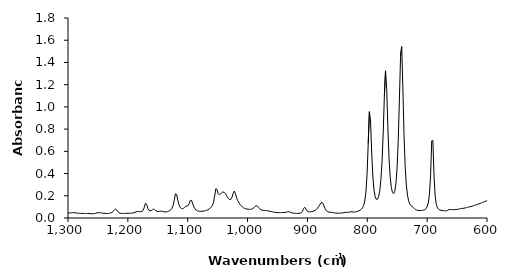
| Category | Series 0 |
|---|---|
| 599.7828 | 0.157 |
| 601.7113 | 0.152 |
| 603.6399 | 0.148 |
| 605.5684 | 0.144 |
| 607.497 | 0.14 |
| 609.4256 | 0.135 |
| 611.3541 | 0.132 |
| 613.2827 | 0.128 |
| 615.2112 | 0.124 |
| 617.1398 | 0.12 |
| 619.0684 | 0.117 |
| 620.9969 | 0.113 |
| 622.9255 | 0.11 |
| 624.8541 | 0.107 |
| 626.7827 | 0.104 |
| 628.7112 | 0.101 |
| 630.6398 | 0.098 |
| 632.5683 | 0.096 |
| 634.4969 | 0.093 |
| 636.4254 | 0.091 |
| 638.354 | 0.088 |
| 640.2826 | 0.087 |
| 642.2111 | 0.086 |
| 644.1397 | 0.084 |
| 646.0682 | 0.082 |
| 647.9968 | 0.079 |
| 649.9254 | 0.077 |
| 651.8539 | 0.076 |
| 653.7825 | 0.076 |
| 655.7111 | 0.075 |
| 657.6396 | 0.075 |
| 659.5682 | 0.076 |
| 661.4968 | 0.077 |
| 663.4253 | 0.076 |
| 665.3539 | 0.071 |
| 667.2824 | 0.064 |
| 669.211 | 0.063 |
| 671.1396 | 0.066 |
| 673.0681 | 0.066 |
| 674.9967 | 0.067 |
| 676.9252 | 0.069 |
| 678.8538 | 0.072 |
| 680.7823 | 0.078 |
| 682.7109 | 0.091 |
| 684.6395 | 0.121 |
| 686.5681 | 0.197 |
| 688.4966 | 0.379 |
| 690.4252 | 0.697 |
| 692.3538 | 0.695 |
| 694.2823 | 0.38 |
| 696.2109 | 0.209 |
| 698.1394 | 0.135 |
| 700.068 | 0.101 |
| 701.9966 | 0.083 |
| 703.9251 | 0.075 |
| 705.8537 | 0.071 |
| 707.7822 | 0.069 |
| 709.7108 | 0.068 |
| 711.6393 | 0.067 |
| 713.5679 | 0.067 |
| 715.4965 | 0.069 |
| 717.425 | 0.072 |
| 719.3536 | 0.077 |
| 721.2822 | 0.084 |
| 723.2108 | 0.095 |
| 725.1393 | 0.104 |
| 727.0679 | 0.112 |
| 728.9964 | 0.126 |
| 730.925 | 0.155 |
| 732.8535 | 0.206 |
| 734.7821 | 0.298 |
| 736.7107 | 0.465 |
| 738.6392 | 0.751 |
| 740.5678 | 1.169 |
| 742.4963 | 1.543 |
| 744.4249 | 1.454 |
| 746.3535 | 1.064 |
| 748.282 | 0.699 |
| 750.2106 | 0.451 |
| 752.1392 | 0.31 |
| 754.0677 | 0.241 |
| 755.9963 | 0.218 |
| 757.9249 | 0.229 |
| 759.8534 | 0.276 |
| 761.782 | 0.371 |
| 763.7105 | 0.543 |
| 765.6391 | 0.821 |
| 767.5677 | 1.167 |
| 769.4962 | 1.325 |
| 771.4248 | 1.102 |
| 773.3533 | 0.776 |
| 775.2819 | 0.515 |
| 777.2104 | 0.345 |
| 779.139 | 0.245 |
| 781.0676 | 0.192 |
| 782.9962 | 0.169 |
| 784.9247 | 0.168 |
| 786.8533 | 0.191 |
| 788.7819 | 0.251 |
| 790.7104 | 0.373 |
| 792.639 | 0.587 |
| 794.5675 | 0.874 |
| 796.4961 | 0.957 |
| 798.4247 | 0.671 |
| 800.3532 | 0.393 |
| 802.2818 | 0.233 |
| 804.2103 | 0.153 |
| 806.1389 | 0.113 |
| 808.0674 | 0.091 |
| 809.996 | 0.078 |
| 811.9246 | 0.07 |
| 813.8531 | 0.065 |
| 815.7817 | 0.061 |
| 817.7103 | 0.058 |
| 819.6389 | 0.055 |
| 821.5674 | 0.053 |
| 823.496 | 0.053 |
| 825.4245 | 0.056 |
| 827.3531 | 0.057 |
| 829.2817 | 0.053 |
| 831.2102 | 0.051 |
| 833.1388 | 0.05 |
| 835.0673 | 0.051 |
| 836.9959 | 0.05 |
| 838.9244 | 0.049 |
| 840.853 | 0.047 |
| 842.7816 | 0.045 |
| 844.7101 | 0.044 |
| 846.6387 | 0.043 |
| 848.5673 | 0.043 |
| 850.4958 | 0.044 |
| 852.4244 | 0.045 |
| 854.353 | 0.046 |
| 856.2815 | 0.047 |
| 858.2101 | 0.049 |
| 860.1386 | 0.05 |
| 862.0672 | 0.051 |
| 863.9958 | 0.053 |
| 865.9243 | 0.056 |
| 867.8529 | 0.063 |
| 869.7814 | 0.077 |
| 871.71 | 0.099 |
| 873.6385 | 0.126 |
| 875.5671 | 0.141 |
| 877.4957 | 0.135 |
| 879.4243 | 0.119 |
| 881.3528 | 0.102 |
| 883.2814 | 0.088 |
| 885.21 | 0.077 |
| 887.1385 | 0.069 |
| 889.0671 | 0.063 |
| 890.9956 | 0.06 |
| 892.9242 | 0.057 |
| 894.8528 | 0.055 |
| 896.7813 | 0.055 |
| 898.7099 | 0.058 |
| 900.6384 | 0.065 |
| 902.567 | 0.08 |
| 904.4955 | 0.097 |
| 906.4241 | 0.086 |
| 908.3527 | 0.061 |
| 910.2813 | 0.048 |
| 912.2098 | 0.043 |
| 914.1384 | 0.042 |
| 916.067 | 0.041 |
| 917.9955 | 0.041 |
| 919.9241 | 0.042 |
| 921.8526 | 0.042 |
| 923.7812 | 0.044 |
| 925.7098 | 0.046 |
| 927.6383 | 0.05 |
| 929.5669 | 0.054 |
| 931.4954 | 0.057 |
| 933.424 | 0.056 |
| 935.3525 | 0.053 |
| 937.2811 | 0.05 |
| 939.2097 | 0.049 |
| 941.1382 | 0.049 |
| 943.0668 | 0.049 |
| 944.9954 | 0.048 |
| 946.924 | 0.048 |
| 948.8525 | 0.048 |
| 950.7811 | 0.049 |
| 952.7096 | 0.05 |
| 954.6382 | 0.051 |
| 956.5667 | 0.053 |
| 958.4953 | 0.055 |
| 960.4239 | 0.058 |
| 962.3524 | 0.06 |
| 964.281 | 0.063 |
| 966.2095 | 0.065 |
| 968.1381 | 0.067 |
| 970.0667 | 0.067 |
| 971.9952 | 0.068 |
| 973.9238 | 0.069 |
| 975.8524 | 0.071 |
| 977.7809 | 0.075 |
| 979.7095 | 0.083 |
| 981.6381 | 0.094 |
| 983.5666 | 0.107 |
| 985.4952 | 0.112 |
| 987.4237 | 0.104 |
| 989.3523 | 0.093 |
| 991.2809 | 0.085 |
| 993.2094 | 0.08 |
| 995.138 | 0.078 |
| 997.0665 | 0.078 |
| 998.9951 | 0.079 |
| 1000.924 | 0.081 |
| 1002.852 | 0.082 |
| 1004.781 | 0.086 |
| 1006.709 | 0.092 |
| 1008.638 | 0.1 |
| 1010.566 | 0.11 |
| 1012.495 | 0.122 |
| 1014.424 | 0.137 |
| 1016.352 | 0.156 |
| 1018.281 | 0.181 |
| 1020.209 | 0.218 |
| 1022.138 | 0.243 |
| 1024.066 | 0.223 |
| 1025.995 | 0.187 |
| 1027.924 | 0.168 |
| 1029.852 | 0.166 |
| 1031.781 | 0.173 |
| 1033.709 | 0.188 |
| 1035.638 | 0.206 |
| 1037.566 | 0.222 |
| 1039.495 | 0.233 |
| 1041.423 | 0.234 |
| 1043.352 | 0.227 |
| 1045.281 | 0.216 |
| 1047.209 | 0.209 |
| 1049.138 | 0.22 |
| 1051.066 | 0.257 |
| 1052.995 | 0.264 |
| 1054.923 | 0.2 |
| 1056.852 | 0.142 |
| 1058.781 | 0.113 |
| 1060.709 | 0.098 |
| 1062.638 | 0.087 |
| 1064.566 | 0.08 |
| 1066.495 | 0.073 |
| 1068.423 | 0.069 |
| 1070.352 | 0.066 |
| 1072.281 | 0.063 |
| 1074.209 | 0.061 |
| 1076.138 | 0.06 |
| 1078.066 | 0.06 |
| 1079.995 | 0.06 |
| 1081.923 | 0.062 |
| 1083.852 | 0.065 |
| 1085.78 | 0.071 |
| 1087.709 | 0.081 |
| 1089.638 | 0.099 |
| 1091.566 | 0.126 |
| 1093.495 | 0.157 |
| 1095.423 | 0.16 |
| 1097.352 | 0.133 |
| 1099.28 | 0.113 |
| 1101.209 | 0.108 |
| 1103.137 | 0.105 |
| 1105.066 | 0.097 |
| 1106.995 | 0.087 |
| 1108.923 | 0.083 |
| 1110.852 | 0.086 |
| 1112.78 | 0.097 |
| 1114.709 | 0.121 |
| 1116.637 | 0.162 |
| 1118.566 | 0.212 |
| 1120.495 | 0.217 |
| 1122.423 | 0.164 |
| 1124.352 | 0.114 |
| 1126.28 | 0.087 |
| 1128.209 | 0.074 |
| 1130.137 | 0.066 |
| 1132.066 | 0.06 |
| 1133.995 | 0.057 |
| 1135.923 | 0.055 |
| 1137.852 | 0.055 |
| 1139.78 | 0.056 |
| 1141.709 | 0.058 |
| 1143.637 | 0.061 |
| 1145.566 | 0.061 |
| 1147.494 | 0.059 |
| 1149.423 | 0.058 |
| 1151.352 | 0.06 |
| 1153.28 | 0.065 |
| 1155.209 | 0.074 |
| 1157.137 | 0.081 |
| 1159.066 | 0.074 |
| 1160.994 | 0.067 |
| 1162.923 | 0.065 |
| 1164.851 | 0.07 |
| 1166.78 | 0.088 |
| 1168.709 | 0.124 |
| 1170.637 | 0.133 |
| 1172.566 | 0.096 |
| 1174.494 | 0.069 |
| 1176.423 | 0.059 |
| 1178.351 | 0.057 |
| 1180.28 | 0.057 |
| 1182.208 | 0.058 |
| 1184.137 | 0.059 |
| 1186.066 | 0.056 |
| 1187.994 | 0.051 |
| 1189.923 | 0.047 |
| 1191.851 | 0.045 |
| 1193.78 | 0.044 |
| 1195.708 | 0.043 |
| 1197.637 | 0.043 |
| 1199.566 | 0.043 |
| 1201.494 | 0.042 |
| 1203.423 | 0.042 |
| 1205.351 | 0.042 |
| 1207.28 | 0.041 |
| 1209.208 | 0.041 |
| 1211.137 | 0.042 |
| 1213.066 | 0.043 |
| 1214.994 | 0.048 |
| 1216.923 | 0.059 |
| 1218.851 | 0.075 |
| 1220.78 | 0.081 |
| 1222.708 | 0.072 |
| 1224.637 | 0.06 |
| 1226.565 | 0.051 |
| 1228.494 | 0.045 |
| 1230.423 | 0.043 |
| 1232.351 | 0.041 |
| 1234.28 | 0.04 |
| 1236.208 | 0.04 |
| 1238.137 | 0.041 |
| 1240.065 | 0.043 |
| 1241.994 | 0.044 |
| 1243.922 | 0.045 |
| 1245.851 | 0.046 |
| 1247.78 | 0.048 |
| 1249.708 | 0.049 |
| 1251.637 | 0.046 |
| 1253.565 | 0.042 |
| 1255.494 | 0.039 |
| 1257.422 | 0.038 |
| 1259.351 | 0.038 |
| 1261.28 | 0.039 |
| 1263.208 | 0.04 |
| 1265.137 | 0.041 |
| 1267.065 | 0.041 |
| 1268.994 | 0.04 |
| 1270.922 | 0.04 |
| 1272.851 | 0.04 |
| 1274.779 | 0.041 |
| 1276.708 | 0.041 |
| 1278.637 | 0.042 |
| 1280.565 | 0.042 |
| 1282.494 | 0.042 |
| 1284.422 | 0.043 |
| 1286.351 | 0.045 |
| 1288.279 | 0.047 |
| 1290.208 | 0.049 |
| 1292.137 | 0.048 |
| 1294.065 | 0.047 |
| 1295.994 | 0.045 |
| 1297.922 | 0.045 |
| 1299.851 | 0.045 |
| 1301.779 | 0.046 |
| 1303.708 | 0.046 |
| 1305.636 | 0.047 |
| 1307.565 | 0.048 |
| 1309.494 | 0.048 |
| 1311.422 | 0.048 |
| 1313.351 | 0.049 |
| 1315.279 | 0.05 |
| 1317.208 | 0.051 |
| 1319.136 | 0.052 |
| 1321.065 | 0.054 |
| 1322.994 | 0.055 |
| 1324.922 | 0.055 |
| 1326.851 | 0.055 |
| 1328.779 | 0.056 |
| 1330.708 | 0.057 |
| 1332.636 | 0.058 |
| 1334.565 | 0.059 |
| 1336.493 | 0.06 |
| 1338.422 | 0.061 |
| 1340.351 | 0.063 |
| 1342.279 | 0.064 |
| 1344.208 | 0.066 |
| 1346.136 | 0.068 |
| 1348.065 | 0.07 |
| 1349.993 | 0.072 |
| 1351.922 | 0.075 |
| 1353.85 | 0.078 |
| 1355.779 | 0.081 |
| 1357.708 | 0.084 |
| 1359.636 | 0.089 |
| 1361.565 | 0.094 |
| 1363.493 | 0.102 |
| 1365.422 | 0.111 |
| 1367.35 | 0.121 |
| 1369.279 | 0.138 |
| 1371.208 | 0.17 |
| 1373.136 | 0.216 |
| 1375.065 | 0.262 |
| 1376.993 | 0.283 |
| 1378.922 | 0.277 |
| 1380.85 | 0.267 |
| 1382.779 | 0.264 |
| 1384.708 | 0.249 |
| 1386.636 | 0.21 |
| 1388.565 | 0.175 |
| 1390.493 | 0.156 |
| 1392.422 | 0.147 |
| 1394.35 | 0.143 |
| 1396.279 | 0.141 |
| 1398.207 | 0.141 |
| 1400.136 | 0.143 |
| 1402.065 | 0.145 |
| 1403.993 | 0.149 |
| 1405.922 | 0.154 |
| 1407.85 | 0.158 |
| 1409.779 | 0.162 |
| 1411.707 | 0.165 |
| 1413.636 | 0.17 |
| 1415.564 | 0.178 |
| 1417.493 | 0.187 |
| 1419.422 | 0.197 |
| 1421.35 | 0.206 |
| 1423.279 | 0.213 |
| 1425.207 | 0.22 |
| 1427.136 | 0.23 |
| 1429.064 | 0.244 |
| 1430.993 | 0.262 |
| 1432.922 | 0.283 |
| 1434.85 | 0.307 |
| 1436.779 | 0.338 |
| 1438.707 | 0.375 |
| 1440.636 | 0.412 |
| 1442.564 | 0.44 |
| 1444.493 | 0.458 |
| 1446.422 | 0.471 |
| 1448.35 | 0.49 |
| 1450.279 | 0.517 |
| 1452.207 | 0.556 |
| 1454.136 | 0.592 |
| 1456.064 | 0.603 |
| 1457.993 | 0.59 |
| 1459.921 | 0.58 |
| 1461.85 | 0.591 |
| 1463.779 | 0.629 |
| 1465.707 | 0.67 |
| 1467.636 | 0.649 |
| 1469.564 | 0.565 |
| 1471.493 | 0.49 |
| 1473.421 | 0.45 |
| 1475.35 | 0.439 |
| 1477.278 | 0.442 |
| 1479.207 | 0.448 |
| 1481.136 | 0.448 |
| 1483.064 | 0.44 |
| 1484.993 | 0.438 |
| 1486.921 | 0.461 |
| 1488.85 | 0.516 |
| 1490.778 | 0.602 |
| 1492.707 | 0.696 |
| 1494.635 | 0.742 |
| 1496.564 | 0.705 |
| 1498.493 | 0.612 |
| 1500.421 | 0.491 |
| 1502.35 | 0.388 |
| 1504.278 | 0.328 |
| 1506.207 | 0.304 |
| 1508.135 | 0.311 |
| 1510.064 | 0.343 |
| 1511.993 | 0.407 |
| 1513.921 | 0.539 |
| 1515.85 | 0.688 |
| 1517.778 | 0.606 |
| 1519.707 | 0.405 |
| 1521.635 | 0.279 |
| 1523.564 | 0.219 |
| 1525.493 | 0.189 |
| 1527.421 | 0.172 |
| 1529.35 | 0.162 |
| 1531.278 | 0.155 |
| 1533.207 | 0.152 |
| 1535.135 | 0.15 |
| 1537.064 | 0.147 |
| 1538.992 | 0.139 |
| 1540.921 | 0.133 |
| 1542.85 | 0.128 |
| 1544.778 | 0.124 |
| 1546.707 | 0.12 |
| 1548.635 | 0.116 |
| 1550.564 | 0.112 |
| 1552.492 | 0.109 |
| 1554.421 | 0.106 |
| 1556.349 | 0.103 |
| 1558.278 | 0.1 |
| 1560.207 | 0.098 |
| 1562.135 | 0.099 |
| 1564.064 | 0.098 |
| 1565.992 | 0.098 |
| 1567.921 | 0.097 |
| 1569.849 | 0.096 |
| 1571.778 | 0.096 |
| 1573.707 | 0.097 |
| 1575.635 | 0.099 |
| 1577.564 | 0.104 |
| 1579.492 | 0.112 |
| 1581.421 | 0.12 |
| 1583.349 | 0.126 |
| 1585.278 | 0.131 |
| 1587.207 | 0.144 |
| 1589.135 | 0.171 |
| 1591.064 | 0.199 |
| 1592.992 | 0.198 |
| 1594.921 | 0.175 |
| 1596.849 | 0.168 |
| 1598.778 | 0.184 |
| 1600.706 | 0.218 |
| 1602.635 | 0.266 |
| 1604.564 | 0.318 |
| 1606.492 | 0.353 |
| 1608.421 | 0.356 |
| 1610.349 | 0.356 |
| 1612.278 | 0.38 |
| 1614.206 | 0.384 |
| 1616.135 | 0.3 |
| 1618.063 | 0.195 |
| 1619.992 | 0.132 |
| 1621.921 | 0.102 |
| 1623.849 | 0.089 |
| 1625.778 | 0.085 |
| 1627.706 | 0.085 |
| 1629.635 | 0.084 |
| 1631.563 | 0.08 |
| 1633.492 | 0.073 |
| 1635.421 | 0.065 |
| 1637.349 | 0.059 |
| 1639.278 | 0.055 |
| 1641.206 | 0.052 |
| 1643.135 | 0.049 |
| 1645.063 | 0.048 |
| 1646.992 | 0.047 |
| 1648.921 | 0.048 |
| 1650.849 | 0.048 |
| 1652.778 | 0.048 |
| 1654.706 | 0.05 |
| 1656.635 | 0.052 |
| 1658.563 | 0.052 |
| 1660.492 | 0.051 |
| 1662.42 | 0.05 |
| 1664.349 | 0.05 |
| 1666.278 | 0.049 |
| 1668.206 | 0.048 |
| 1670.135 | 0.047 |
| 1672.063 | 0.046 |
| 1673.992 | 0.044 |
| 1675.92 | 0.042 |
| 1677.849 | 0.04 |
| 1679.777 | 0.038 |
| 1681.706 | 0.035 |
| 1683.635 | 0.031 |
| 1685.563 | 0.03 |
| 1687.492 | 0.031 |
| 1689.42 | 0.031 |
| 1691.349 | 0.032 |
| 1693.277 | 0.031 |
| 1695.206 | 0.029 |
| 1697.135 | 0.028 |
| 1699.063 | 0.027 |
| 1700.992 | 0.027 |
| 1702.92 | 0.029 |
| 1704.849 | 0.03 |
| 1706.777 | 0.032 |
| 1708.706 | 0.032 |
| 1710.635 | 0.031 |
| 1712.563 | 0.031 |
| 1714.492 | 0.032 |
| 1716.42 | 0.032 |
| 1718.349 | 0.032 |
| 1720.277 | 0.033 |
| 1722.206 | 0.033 |
| 1724.134 | 0.033 |
| 1726.063 | 0.033 |
| 1727.992 | 0.034 |
| 1729.92 | 0.034 |
| 1731.849 | 0.033 |
| 1733.777 | 0.033 |
| 1735.706 | 0.035 |
| 1737.634 | 0.037 |
| 1739.563 | 0.039 |
| 1741.491 | 0.04 |
| 1743.42 | 0.042 |
| 1745.349 | 0.043 |
| 1747.277 | 0.043 |
| 1749.206 | 0.042 |
| 1751.134 | 0.041 |
| 1753.063 | 0.041 |
| 1754.991 | 0.04 |
| 1756.92 | 0.04 |
| 1758.849 | 0.04 |
| 1760.777 | 0.041 |
| 1762.706 | 0.043 |
| 1764.634 | 0.045 |
| 1766.563 | 0.045 |
| 1768.491 | 0.046 |
| 1770.42 | 0.046 |
| 1772.349 | 0.046 |
| 1774.277 | 0.048 |
| 1776.206 | 0.049 |
| 1778.134 | 0.051 |
| 1780.063 | 0.053 |
| 1781.991 | 0.055 |
| 1783.92 | 0.057 |
| 1785.848 | 0.06 |
| 1787.777 | 0.062 |
| 1789.706 | 0.061 |
| 1791.634 | 0.059 |
| 1793.563 | 0.055 |
| 1795.491 | 0.051 |
| 1797.42 | 0.046 |
| 1799.348 | 0.041 |
| 1801.277 | 0.037 |
| 1803.205 | 0.034 |
| 1805.134 | 0.032 |
| 1807.063 | 0.031 |
| 1808.991 | 0.03 |
| 1810.92 | 0.029 |
| 1812.848 | 0.029 |
| 1814.777 | 0.029 |
| 1816.705 | 0.029 |
| 1818.634 | 0.03 |
| 1820.563 | 0.031 |
| 1822.491 | 0.033 |
| 1824.42 | 0.034 |
| 1826.348 | 0.036 |
| 1828.277 | 0.038 |
| 1830.205 | 0.038 |
| 1832.134 | 0.039 |
| 1834.063 | 0.039 |
| 1835.991 | 0.039 |
| 1837.92 | 0.039 |
| 1839.848 | 0.04 |
| 1841.777 | 0.041 |
| 1843.705 | 0.043 |
| 1845.634 | 0.045 |
| 1847.562 | 0.047 |
| 1849.491 | 0.05 |
| 1851.42 | 0.052 |
| 1853.348 | 0.054 |
| 1855.277 | 0.056 |
| 1857.205 | 0.056 |
| 1859.134 | 0.055 |
| 1861.062 | 0.053 |
| 1862.991 | 0.05 |
| 1864.919 | 0.046 |
| 1866.848 | 0.043 |
| 1868.777 | 0.04 |
| 1870.705 | 0.039 |
| 1872.634 | 0.039 |
| 1874.562 | 0.041 |
| 1876.491 | 0.043 |
| 1878.419 | 0.047 |
| 1880.348 | 0.051 |
| 1882.276 | 0.055 |
| 1884.205 | 0.058 |
| 1886.134 | 0.063 |
| 1888.062 | 0.067 |
| 1889.991 | 0.071 |
| 1891.919 | 0.073 |
| 1893.848 | 0.073 |
| 1895.776 | 0.07 |
| 1897.705 | 0.067 |
| 1899.634 | 0.064 |
| 1901.562 | 0.061 |
| 1903.491 | 0.057 |
| 1905.419 | 0.053 |
| 1907.348 | 0.048 |
| 1909.276 | 0.044 |
| 1911.205 | 0.041 |
| 1913.134 | 0.039 |
| 1915.062 | 0.038 |
| 1916.991 | 0.037 |
| 1918.919 | 0.038 |
| 1920.848 | 0.039 |
| 1922.776 | 0.042 |
| 1924.705 | 0.044 |
| 1926.633 | 0.047 |
| 1928.562 | 0.05 |
| 1930.491 | 0.052 |
| 1932.419 | 0.053 |
| 1934.348 | 0.054 |
| 1936.276 | 0.054 |
| 1938.205 | 0.053 |
| 1940.133 | 0.051 |
| 1942.062 | 0.049 |
| 1943.99 | 0.046 |
| 1945.919 | 0.042 |
| 1947.848 | 0.039 |
| 1949.776 | 0.036 |
| 1951.705 | 0.033 |
| 1953.633 | 0.031 |
| 1955.562 | 0.029 |
| 1957.49 | 0.028 |
| 1959.419 | 0.026 |
| 1961.348 | 0.024 |
| 1963.276 | 0.024 |
| 1965.205 | 0.023 |
| 1967.133 | 0.023 |
| 1969.062 | 0.023 |
| 1970.99 | 0.022 |
| 1972.919 | 0.022 |
| 1974.848 | 0.022 |
| 1976.776 | 0.021 |
| 1978.705 | 0.021 |
| 1980.633 | 0.021 |
| 1982.562 | 0.021 |
| 1984.49 | 0.02 |
| 1986.419 | 0.02 |
| 1988.347 | 0.02 |
| 1990.276 | 0.02 |
| 1992.205 | 0.021 |
| 1994.133 | 0.021 |
| 1996.062 | 0.021 |
| 1997.99 | 0.021 |
| 1999.919 | 0.02 |
| 2001.847 | 0.02 |
| 2003.776 | 0.019 |
| 2005.704 | 0.019 |
| 2007.633 | 0.019 |
| 2009.562 | 0.018 |
| 2011.49 | 0.018 |
| 2013.419 | 0.018 |
| 2015.347 | 0.018 |
| 2017.276 | 0.018 |
| 2019.204 | 0.018 |
| 2021.133 | 0.018 |
| 2023.062 | 0.018 |
| 2024.99 | 0.018 |
| 2026.919 | 0.018 |
| 2028.847 | 0.017 |
| 2030.776 | 0.017 |
| 2032.704 | 0.017 |
| 2034.633 | 0.017 |
| 2036.562 | 0.017 |
| 2038.49 | 0.017 |
| 2040.419 | 0.017 |
| 2042.347 | 0.017 |
| 2044.276 | 0.017 |
| 2046.204 | 0.017 |
| 2048.133 | 0.017 |
| 2050.062 | 0.017 |
| 2051.99 | 0.016 |
| 2053.918 | 0.016 |
| 2055.847 | 0.016 |
| 2057.776 | 0.016 |
| 2059.704 | 0.016 |
| 2061.633 | 0.016 |
| 2063.561 | 0.016 |
| 2065.49 | 0.016 |
| 2067.418 | 0.016 |
| 2069.347 | 0.017 |
| 2071.276 | 0.017 |
| 2073.204 | 0.018 |
| 2075.133 | 0.019 |
| 2077.061 | 0.018 |
| 2078.99 | 0.018 |
| 2080.918 | 0.017 |
| 2082.847 | 0.017 |
| 2084.776 | 0.017 |
| 2086.704 | 0.017 |
| 2088.633 | 0.017 |
| 2090.561 | 0.017 |
| 2092.49 | 0.018 |
| 2094.418 | 0.019 |
| 2096.347 | 0.02 |
| 2098.275 | 0.022 |
| 2100.204 | 0.022 |
| 2102.133 | 0.022 |
| 2104.061 | 0.021 |
| 2105.99 | 0.02 |
| 2107.918 | 0.019 |
| 2109.847 | 0.018 |
| 2111.775 | 0.018 |
| 2113.704 | 0.018 |
| 2115.633 | 0.018 |
| 2117.561 | 0.018 |
| 2119.49 | 0.017 |
| 2121.418 | 0.017 |
| 2123.347 | 0.016 |
| 2125.275 | 0.016 |
| 2127.204 | 0.016 |
| 2129.133 | 0.016 |
| 2131.061 | 0.016 |
| 2132.99 | 0.016 |
| 2134.918 | 0.016 |
| 2136.847 | 0.016 |
| 2138.775 | 0.016 |
| 2140.704 | 0.016 |
| 2142.632 | 0.016 |
| 2144.561 | 0.017 |
| 2146.49 | 0.017 |
| 2148.418 | 0.017 |
| 2150.347 | 0.017 |
| 2152.275 | 0.017 |
| 2154.204 | 0.017 |
| 2156.132 | 0.017 |
| 2158.061 | 0.017 |
| 2159.99 | 0.017 |
| 2161.918 | 0.017 |
| 2163.847 | 0.017 |
| 2165.775 | 0.017 |
| 2167.704 | 0.017 |
| 2169.632 | 0.017 |
| 2171.561 | 0.017 |
| 2173.49 | 0.017 |
| 2175.418 | 0.017 |
| 2177.346 | 0.017 |
| 2179.275 | 0.017 |
| 2181.204 | 0.017 |
| 2183.132 | 0.017 |
| 2185.061 | 0.017 |
| 2186.989 | 0.017 |
| 2188.918 | 0.017 |
| 2190.846 | 0.017 |
| 2192.775 | 0.018 |
| 2194.704 | 0.018 |
| 2196.632 | 0.019 |
| 2198.561 | 0.02 |
| 2200.489 | 0.02 |
| 2202.418 | 0.02 |
| 2204.346 | 0.02 |
| 2206.275 | 0.02 |
| 2208.204 | 0.02 |
| 2210.132 | 0.02 |
| 2212.061 | 0.02 |
| 2213.989 | 0.019 |
| 2215.918 | 0.019 |
| 2217.846 | 0.018 |
| 2219.775 | 0.018 |
| 2221.703 | 0.018 |
| 2223.632 | 0.018 |
| 2225.561 | 0.018 |
| 2227.489 | 0.018 |
| 2229.418 | 0.018 |
| 2231.346 | 0.018 |
| 2233.275 | 0.018 |
| 2235.203 | 0.017 |
| 2237.132 | 0.017 |
| 2239.061 | 0.017 |
| 2240.989 | 0.017 |
| 2242.918 | 0.017 |
| 2244.846 | 0.017 |
| 2246.775 | 0.017 |
| 2248.703 | 0.017 |
| 2250.632 | 0.017 |
| 2252.561 | 0.017 |
| 2254.489 | 0.018 |
| 2256.417 | 0.018 |
| 2258.346 | 0.019 |
| 2260.275 | 0.02 |
| 2262.203 | 0.02 |
| 2264.132 | 0.021 |
| 2266.06 | 0.021 |
| 2267.989 | 0.021 |
| 2269.917 | 0.021 |
| 2271.846 | 0.021 |
| 2273.775 | 0.022 |
| 2275.703 | 0.024 |
| 2277.632 | 0.025 |
| 2279.56 | 0.025 |
| 2281.489 | 0.025 |
| 2283.417 | 0.025 |
| 2285.346 | 0.023 |
| 2287.275 | 0.022 |
| 2289.203 | 0.021 |
| 2291.132 | 0.021 |
| 2293.06 | 0.021 |
| 2294.989 | 0.021 |
| 2296.917 | 0.022 |
| 2298.846 | 0.022 |
| 2300.774 | 0.024 |
| 2302.703 | 0.025 |
| 2304.632 | 0.024 |
| 2306.56 | 0.023 |
| 2308.489 | 0.021 |
| 2310.417 | 0.02 |
| 2312.346 | 0.02 |
| 2314.274 | 0.019 |
| 2316.203 | 0.019 |
| 2318.132 | 0.018 |
| 2320.06 | 0.017 |
| 2321.989 | 0.017 |
| 2323.917 | 0.017 |
| 2325.846 | 0.019 |
| 2327.774 | 0.019 |
| 2329.703 | 0.019 |
| 2331.632 | 0.019 |
| 2333.56 | 0.019 |
| 2335.489 | 0.02 |
| 2337.417 | 0.022 |
| 2339.346 | 0.023 |
| 2341.274 | 0.023 |
| 2343.203 | 0.022 |
| 2345.131 | 0.02 |
| 2347.06 | 0.019 |
| 2348.989 | 0.019 |
| 2350.917 | 0.017 |
| 2352.846 | 0.014 |
| 2354.774 | 0.013 |
| 2356.703 | 0.012 |
| 2358.631 | 0.011 |
| 2360.56 | 0.011 |
| 2362.489 | 0.011 |
| 2364.417 | 0.011 |
| 2366.346 | 0.011 |
| 2368.274 | 0.012 |
| 2370.203 | 0.013 |
| 2372.131 | 0.015 |
| 2374.06 | 0.016 |
| 2375.989 | 0.018 |
| 2377.917 | 0.019 |
| 2379.845 | 0.02 |
| 2381.774 | 0.021 |
| 2383.703 | 0.022 |
| 2385.631 | 0.022 |
| 2387.56 | 0.023 |
| 2389.488 | 0.023 |
| 2391.417 | 0.024 |
| 2393.345 | 0.025 |
| 2395.274 | 0.026 |
| 2397.203 | 0.027 |
| 2399.131 | 0.027 |
| 2401.06 | 0.028 |
| 2402.988 | 0.028 |
| 2404.917 | 0.028 |
| 2406.845 | 0.028 |
| 2408.774 | 0.028 |
| 2410.703 | 0.028 |
| 2412.631 | 0.028 |
| 2414.56 | 0.028 |
| 2416.488 | 0.028 |
| 2418.417 | 0.028 |
| 2420.345 | 0.028 |
| 2422.274 | 0.028 |
| 2424.202 | 0.028 |
| 2426.131 | 0.028 |
| 2428.06 | 0.028 |
| 2429.988 | 0.028 |
| 2431.917 | 0.028 |
| 2433.845 | 0.027 |
| 2435.774 | 0.026 |
| 2437.702 | 0.026 |
| 2439.631 | 0.026 |
| 2441.56 | 0.026 |
| 2443.488 | 0.026 |
| 2445.417 | 0.026 |
| 2447.345 | 0.026 |
| 2449.274 | 0.026 |
| 2451.202 | 0.025 |
| 2453.131 | 0.024 |
| 2455.06 | 0.024 |
| 2456.988 | 0.025 |
| 2458.917 | 0.025 |
| 2460.845 | 0.025 |
| 2462.774 | 0.025 |
| 2464.702 | 0.025 |
| 2466.631 | 0.025 |
| 2468.559 | 0.025 |
| 2470.488 | 0.026 |
| 2472.417 | 0.026 |
| 2474.345 | 0.026 |
| 2476.274 | 0.026 |
| 2478.202 | 0.025 |
| 2480.131 | 0.024 |
| 2482.059 | 0.023 |
| 2483.988 | 0.023 |
| 2485.917 | 0.023 |
| 2487.845 | 0.022 |
| 2489.774 | 0.022 |
| 2491.702 | 0.022 |
| 2493.631 | 0.022 |
| 2495.559 | 0.021 |
| 2497.488 | 0.021 |
| 2499.416 | 0.021 |
| 2501.345 | 0.021 |
| 2503.273 | 0.021 |
| 2505.202 | 0.021 |
| 2507.131 | 0.021 |
| 2509.059 | 0.021 |
| 2510.988 | 0.02 |
| 2512.916 | 0.02 |
| 2514.845 | 0.02 |
| 2516.773 | 0.019 |
| 2518.702 | 0.019 |
| 2520.631 | 0.019 |
| 2522.559 | 0.019 |
| 2524.488 | 0.019 |
| 2526.416 | 0.02 |
| 2528.345 | 0.021 |
| 2530.273 | 0.022 |
| 2532.202 | 0.023 |
| 2534.131 | 0.023 |
| 2536.059 | 0.022 |
| 2537.988 | 0.021 |
| 2539.916 | 0.02 |
| 2541.845 | 0.02 |
| 2543.773 | 0.019 |
| 2545.702 | 0.019 |
| 2547.63 | 0.019 |
| 2549.559 | 0.02 |
| 2551.488 | 0.02 |
| 2553.416 | 0.02 |
| 2555.345 | 0.021 |
| 2557.273 | 0.022 |
| 2559.202 | 0.022 |
| 2561.13 | 0.022 |
| 2563.059 | 0.022 |
| 2564.988 | 0.022 |
| 2566.916 | 0.023 |
| 2568.845 | 0.023 |
| 2570.773 | 0.024 |
| 2572.702 | 0.025 |
| 2574.63 | 0.026 |
| 2576.559 | 0.028 |
| 2578.487 | 0.03 |
| 2580.416 | 0.031 |
| 2582.344 | 0.03 |
| 2584.273 | 0.029 |
| 2586.202 | 0.028 |
| 2588.13 | 0.027 |
| 2590.059 | 0.026 |
| 2591.987 | 0.025 |
| 2593.916 | 0.025 |
| 2595.844 | 0.025 |
| 2597.773 | 0.024 |
| 2599.702 | 0.024 |
| 2601.63 | 0.024 |
| 2603.559 | 0.024 |
| 2605.487 | 0.024 |
| 2607.416 | 0.023 |
| 2609.344 | 0.023 |
| 2611.273 | 0.022 |
| 2613.202 | 0.022 |
| 2615.13 | 0.021 |
| 2617.059 | 0.021 |
| 2618.987 | 0.021 |
| 2620.916 | 0.022 |
| 2622.844 | 0.022 |
| 2624.773 | 0.023 |
| 2626.701 | 0.022 |
| 2628.63 | 0.022 |
| 2630.559 | 0.022 |
| 2632.487 | 0.021 |
| 2634.416 | 0.021 |
| 2636.344 | 0.022 |
| 2638.273 | 0.022 |
| 2640.201 | 0.021 |
| 2642.13 | 0.021 |
| 2644.059 | 0.021 |
| 2645.987 | 0.021 |
| 2647.916 | 0.021 |
| 2649.844 | 0.021 |
| 2651.773 | 0.021 |
| 2653.701 | 0.021 |
| 2655.63 | 0.021 |
| 2657.558 | 0.021 |
| 2659.487 | 0.021 |
| 2661.416 | 0.021 |
| 2663.344 | 0.021 |
| 2665.273 | 0.021 |
| 2667.201 | 0.021 |
| 2669.13 | 0.021 |
| 2671.058 | 0.021 |
| 2672.987 | 0.022 |
| 2674.916 | 0.022 |
| 2676.844 | 0.022 |
| 2678.773 | 0.022 |
| 2680.701 | 0.022 |
| 2682.63 | 0.022 |
| 2684.558 | 0.022 |
| 2686.487 | 0.022 |
| 2688.416 | 0.022 |
| 2690.344 | 0.023 |
| 2692.272 | 0.023 |
| 2694.201 | 0.024 |
| 2696.13 | 0.024 |
| 2698.058 | 0.025 |
| 2699.987 | 0.025 |
| 2701.915 | 0.026 |
| 2703.844 | 0.027 |
| 2705.772 | 0.028 |
| 2707.701 | 0.029 |
| 2709.63 | 0.031 |
| 2711.558 | 0.033 |
| 2713.487 | 0.035 |
| 2715.415 | 0.037 |
| 2717.344 | 0.041 |
| 2719.272 | 0.045 |
| 2721.201 | 0.05 |
| 2723.13 | 0.057 |
| 2725.058 | 0.067 |
| 2726.987 | 0.082 |
| 2728.915 | 0.099 |
| 2730.844 | 0.11 |
| 2732.772 | 0.109 |
| 2734.701 | 0.094 |
| 2736.629 | 0.076 |
| 2738.558 | 0.061 |
| 2740.487 | 0.05 |
| 2742.415 | 0.044 |
| 2744.344 | 0.04 |
| 2746.272 | 0.037 |
| 2748.201 | 0.036 |
| 2750.129 | 0.035 |
| 2752.058 | 0.035 |
| 2753.987 | 0.035 |
| 2755.915 | 0.036 |
| 2757.844 | 0.037 |
| 2759.772 | 0.038 |
| 2761.701 | 0.038 |
| 2763.629 | 0.038 |
| 2765.558 | 0.037 |
| 2767.487 | 0.036 |
| 2769.415 | 0.035 |
| 2771.344 | 0.035 |
| 2773.272 | 0.035 |
| 2775.201 | 0.036 |
| 2777.129 | 0.036 |
| 2779.058 | 0.037 |
| 2780.986 | 0.038 |
| 2782.915 | 0.038 |
| 2784.844 | 0.039 |
| 2786.772 | 0.041 |
| 2788.701 | 0.042 |
| 2790.629 | 0.043 |
| 2792.558 | 0.045 |
| 2794.486 | 0.046 |
| 2796.415 | 0.047 |
| 2798.344 | 0.049 |
| 2800.272 | 0.051 |
| 2802.201 | 0.054 |
| 2804.129 | 0.056 |
| 2806.058 | 0.058 |
| 2807.986 | 0.061 |
| 2809.915 | 0.063 |
| 2811.844 | 0.066 |
| 2813.772 | 0.07 |
| 2815.7 | 0.073 |
| 2817.629 | 0.077 |
| 2819.558 | 0.082 |
| 2821.486 | 0.086 |
| 2823.415 | 0.091 |
| 2825.343 | 0.095 |
| 2827.272 | 0.1 |
| 2829.2 | 0.106 |
| 2831.129 | 0.114 |
| 2833.058 | 0.123 |
| 2834.986 | 0.133 |
| 2836.915 | 0.144 |
| 2838.843 | 0.157 |
| 2840.772 | 0.173 |
| 2842.7 | 0.192 |
| 2844.629 | 0.215 |
| 2846.558 | 0.241 |
| 2848.486 | 0.272 |
| 2850.415 | 0.305 |
| 2852.343 | 0.34 |
| 2854.272 | 0.378 |
| 2856.2 | 0.413 |
| 2858.129 | 0.443 |
| 2860.057 | 0.465 |
| 2861.986 | 0.48 |
| 2863.915 | 0.487 |
| 2865.843 | 0.488 |
| 2867.772 | 0.484 |
| 2869.7 | 0.478 |
| 2871.629 | 0.471 |
| 2873.557 | 0.464 |
| 2875.486 | 0.456 |
| 2877.415 | 0.448 |
| 2879.343 | 0.44 |
| 2881.272 | 0.433 |
| 2883.2 | 0.429 |
| 2885.129 | 0.426 |
| 2887.057 | 0.424 |
| 2888.986 | 0.425 |
| 2890.915 | 0.426 |
| 2892.843 | 0.428 |
| 2894.771 | 0.431 |
| 2896.7 | 0.437 |
| 2898.629 | 0.447 |
| 2900.557 | 0.464 |
| 2902.486 | 0.487 |
| 2904.414 | 0.515 |
| 2906.343 | 0.551 |
| 2908.271 | 0.595 |
| 2910.2 | 0.65 |
| 2912.129 | 0.715 |
| 2914.057 | 0.789 |
| 2915.986 | 0.864 |
| 2917.914 | 0.928 |
| 2919.843 | 0.969 |
| 2921.771 | 0.975 |
| 2923.7 | 0.946 |
| 2925.629 | 0.891 |
| 2927.557 | 0.828 |
| 2929.486 | 0.775 |
| 2931.414 | 0.739 |
| 2933.343 | 0.722 |
| 2935.271 | 0.72 |
| 2937.2 | 0.727 |
| 2939.128 | 0.735 |
| 2941.057 | 0.736 |
| 2942.986 | 0.726 |
| 2944.914 | 0.708 |
| 2946.843 | 0.685 |
| 2948.771 | 0.662 |
| 2950.7 | 0.64 |
| 2952.628 | 0.621 |
| 2954.557 | 0.602 |
| 2956.486 | 0.587 |
| 2958.414 | 0.577 |
| 2960.343 | 0.575 |
| 2962.271 | 0.581 |
| 2964.2 | 0.592 |
| 2966.128 | 0.606 |
| 2968.057 | 0.619 |
| 2969.986 | 0.626 |
| 2971.914 | 0.622 |
| 2973.843 | 0.605 |
| 2975.771 | 0.579 |
| 2977.7 | 0.549 |
| 2979.628 | 0.519 |
| 2981.557 | 0.493 |
| 2983.485 | 0.474 |
| 2985.414 | 0.461 |
| 2987.343 | 0.454 |
| 2989.271 | 0.453 |
| 2991.2 | 0.456 |
| 2993.128 | 0.459 |
| 2995.057 | 0.465 |
| 2996.985 | 0.475 |
| 2998.914 | 0.487 |
| 3000.843 | 0.499 |
| 3002.771 | 0.514 |
| 3004.7 | 0.537 |
| 3006.628 | 0.571 |
| 3008.557 | 0.614 |
| 3010.485 | 0.664 |
| 3012.414 | 0.719 |
| 3014.343 | 0.77 |
| 3016.271 | 0.801 |
| 3018.199 | 0.8 |
| 3020.128 | 0.772 |
| 3022.057 | 0.734 |
| 3023.985 | 0.697 |
| 3025.914 | 0.664 |
| 3027.842 | 0.635 |
| 3029.771 | 0.609 |
| 3031.699 | 0.587 |
| 3033.628 | 0.567 |
| 3035.557 | 0.549 |
| 3037.485 | 0.534 |
| 3039.414 | 0.522 |
| 3041.342 | 0.515 |
| 3043.271 | 0.512 |
| 3045.199 | 0.511 |
| 3047.128 | 0.509 |
| 3049.057 | 0.499 |
| 3050.985 | 0.478 |
| 3052.914 | 0.449 |
| 3054.842 | 0.418 |
| 3056.771 | 0.39 |
| 3058.699 | 0.365 |
| 3060.628 | 0.346 |
| 3062.556 | 0.33 |
| 3064.485 | 0.315 |
| 3066.414 | 0.299 |
| 3068.342 | 0.28 |
| 3070.271 | 0.259 |
| 3072.199 | 0.239 |
| 3074.128 | 0.224 |
| 3076.056 | 0.214 |
| 3077.985 | 0.207 |
| 3079.914 | 0.197 |
| 3081.842 | 0.183 |
| 3083.771 | 0.167 |
| 3085.699 | 0.152 |
| 3087.628 | 0.143 |
| 3089.556 | 0.137 |
| 3091.485 | 0.134 |
| 3093.414 | 0.132 |
| 3095.342 | 0.129 |
| 3097.271 | 0.126 |
| 3099.199 | 0.122 |
| 3101.128 | 0.12 |
| 3103.056 | 0.121 |
| 3104.985 | 0.122 |
| 3106.913 | 0.121 |
| 3108.842 | 0.115 |
| 3110.771 | 0.103 |
| 3112.699 | 0.089 |
| 3114.628 | 0.077 |
| 3116.556 | 0.068 |
| 3118.485 | 0.062 |
| 3120.413 | 0.057 |
| 3122.342 | 0.054 |
| 3124.271 | 0.052 |
| 3126.199 | 0.05 |
| 3128.128 | 0.049 |
| 3130.056 | 0.05 |
| 3131.985 | 0.05 |
| 3133.913 | 0.051 |
| 3135.842 | 0.05 |
| 3137.771 | 0.048 |
| 3139.699 | 0.044 |
| 3141.627 | 0.041 |
| 3143.556 | 0.039 |
| 3145.485 | 0.038 |
| 3147.413 | 0.037 |
| 3149.342 | 0.036 |
| 3151.27 | 0.036 |
| 3153.199 | 0.035 |
| 3155.127 | 0.035 |
| 3157.056 | 0.034 |
| 3158.985 | 0.034 |
| 3160.913 | 0.033 |
| 3162.842 | 0.032 |
| 3164.77 | 0.032 |
| 3166.699 | 0.031 |
| 3168.627 | 0.03 |
| 3170.556 | 0.029 |
| 3172.485 | 0.029 |
| 3174.413 | 0.029 |
| 3176.342 | 0.028 |
| 3178.27 | 0.028 |
| 3180.199 | 0.028 |
| 3182.127 | 0.027 |
| 3184.056 | 0.027 |
| 3185.984 | 0.026 |
| 3187.913 | 0.026 |
| 3189.842 | 0.026 |
| 3191.77 | 0.026 |
| 3193.699 | 0.026 |
| 3195.627 | 0.025 |
| 3197.556 | 0.025 |
| 3199.484 | 0.025 |
| 3201.413 | 0.025 |
| 3203.342 | 0.025 |
| 3205.27 | 0.025 |
| 3207.199 | 0.024 |
| 3209.127 | 0.024 |
| 3211.056 | 0.024 |
| 3212.984 | 0.024 |
| 3214.913 | 0.023 |
| 3216.842 | 0.023 |
| 3218.77 | 0.023 |
| 3220.698 | 0.023 |
| 3222.627 | 0.023 |
| 3224.556 | 0.023 |
| 3226.484 | 0.023 |
| 3228.413 | 0.023 |
| 3230.341 | 0.023 |
| 3232.27 | 0.023 |
| 3234.198 | 0.023 |
| 3236.127 | 0.023 |
| 3238.056 | 0.023 |
| 3239.984 | 0.023 |
| 3241.913 | 0.023 |
| 3243.841 | 0.023 |
| 3245.77 | 0.023 |
| 3247.698 | 0.023 |
| 3249.627 | 0.023 |
| 3251.556 | 0.023 |
| 3253.484 | 0.023 |
| 3255.413 | 0.023 |
| 3257.341 | 0.023 |
| 3259.27 | 0.023 |
| 3261.198 | 0.022 |
| 3263.127 | 0.022 |
| 3265.055 | 0.022 |
| 3266.984 | 0.022 |
| 3268.913 | 0.022 |
| 3270.841 | 0.022 |
| 3272.77 | 0.022 |
| 3274.698 | 0.022 |
| 3276.627 | 0.022 |
| 3278.555 | 0.022 |
| 3280.484 | 0.022 |
| 3282.413 | 0.021 |
| 3284.341 | 0.021 |
| 3286.27 | 0.021 |
| 3288.198 | 0.021 |
| 3290.127 | 0.021 |
| 3292.055 | 0.021 |
| 3293.984 | 0.021 |
| 3295.913 | 0.021 |
| 3297.841 | 0.021 |
| 3299.77 | 0.021 |
| 3301.698 | 0.021 |
| 3303.627 | 0.021 |
| 3305.555 | 0.021 |
| 3307.484 | 0.021 |
| 3309.412 | 0.021 |
| 3311.341 | 0.021 |
| 3313.27 | 0.021 |
| 3315.198 | 0.021 |
| 3317.127 | 0.021 |
| 3319.055 | 0.021 |
| 3320.984 | 0.021 |
| 3322.912 | 0.021 |
| 3324.841 | 0.021 |
| 3326.77 | 0.021 |
| 3328.698 | 0.021 |
| 3330.627 | 0.021 |
| 3332.555 | 0.02 |
| 3334.484 | 0.02 |
| 3336.412 | 0.021 |
| 3338.341 | 0.021 |
| 3340.27 | 0.02 |
| 3342.198 | 0.021 |
| 3344.126 | 0.021 |
| 3346.055 | 0.021 |
| 3347.984 | 0.021 |
| 3349.912 | 0.021 |
| 3351.841 | 0.021 |
| 3353.769 | 0.02 |
| 3355.698 | 0.021 |
| 3357.626 | 0.021 |
| 3359.555 | 0.021 |
| 3361.484 | 0.021 |
| 3363.412 | 0.021 |
| 3365.341 | 0.021 |
| 3367.269 | 0.021 |
| 3369.198 | 0.021 |
| 3371.126 | 0.021 |
| 3373.055 | 0.021 |
| 3374.984 | 0.021 |
| 3376.912 | 0.021 |
| 3378.841 | 0.021 |
| 3380.769 | 0.021 |
| 3382.698 | 0.021 |
| 3384.626 | 0.021 |
| 3386.555 | 0.02 |
| 3388.483 | 0.02 |
| 3390.412 | 0.02 |
| 3392.341 | 0.02 |
| 3394.269 | 0.02 |
| 3396.198 | 0.02 |
| 3398.126 | 0.02 |
| 3400.055 | 0.02 |
| 3401.983 | 0.02 |
| 3403.912 | 0.02 |
| 3405.841 | 0.02 |
| 3407.769 | 0.02 |
| 3409.698 | 0.02 |
| 3411.626 | 0.02 |
| 3413.555 | 0.02 |
| 3415.483 | 0.02 |
| 3417.412 | 0.02 |
| 3419.341 | 0.02 |
| 3421.269 | 0.02 |
| 3423.198 | 0.02 |
| 3425.126 | 0.02 |
| 3427.055 | 0.02 |
| 3428.983 | 0.02 |
| 3430.912 | 0.02 |
| 3432.84 | 0.021 |
| 3434.769 | 0.021 |
| 3436.698 | 0.021 |
| 3438.626 | 0.02 |
| 3440.555 | 0.02 |
| 3442.483 | 0.02 |
| 3444.412 | 0.02 |
| 3446.34 | 0.02 |
| 3448.269 | 0.02 |
| 3450.198 | 0.02 |
| 3452.126 | 0.02 |
| 3454.055 | 0.02 |
| 3455.983 | 0.02 |
| 3457.912 | 0.02 |
| 3459.84 | 0.02 |
| 3461.769 | 0.02 |
| 3463.698 | 0.02 |
| 3465.626 | 0.02 |
| 3467.554 | 0.02 |
| 3469.483 | 0.019 |
| 3471.412 | 0.019 |
| 3473.34 | 0.019 |
| 3475.269 | 0.019 |
| 3477.197 | 0.019 |
| 3479.126 | 0.019 |
| 3481.054 | 0.019 |
| 3482.983 | 0.019 |
| 3484.912 | 0.019 |
| 3486.84 | 0.018 |
| 3488.769 | 0.018 |
| 3490.697 | 0.018 |
| 3492.626 | 0.018 |
| 3494.554 | 0.018 |
| 3496.483 | 0.018 |
| 3498.412 | 0.018 |
| 3500.34 | 0.018 |
| 3502.269 | 0.018 |
| 3504.197 | 0.018 |
| 3506.126 | 0.018 |
| 3508.054 | 0.017 |
| 3509.983 | 0.017 |
| 3511.911 | 0.017 |
| 3513.84 | 0.017 |
| 3515.769 | 0.017 |
| 3517.697 | 0.017 |
| 3519.626 | 0.017 |
| 3521.554 | 0.017 |
| 3523.483 | 0.017 |
| 3525.411 | 0.017 |
| 3527.34 | 0.017 |
| 3529.269 | 0.017 |
| 3531.197 | 0.017 |
| 3533.126 | 0.017 |
| 3535.054 | 0.017 |
| 3536.983 | 0.018 |
| 3538.911 | 0.018 |
| 3540.84 | 0.018 |
| 3542.769 | 0.018 |
| 3544.697 | 0.018 |
| 3546.625 | 0.018 |
| 3548.554 | 0.018 |
| 3550.483 | 0.018 |
| 3552.411 | 0.018 |
| 3554.34 | 0.018 |
| 3556.268 | 0.018 |
| 3558.197 | 0.017 |
| 3560.125 | 0.017 |
| 3562.054 | 0.017 |
| 3563.983 | 0.017 |
| 3565.911 | 0.016 |
| 3567.84 | 0.016 |
| 3569.768 | 0.017 |
| 3571.697 | 0.017 |
| 3573.625 | 0.017 |
| 3575.554 | 0.017 |
| 3577.483 | 0.017 |
| 3579.411 | 0.017 |
| 3581.34 | 0.017 |
| 3583.268 | 0.017 |
| 3585.197 | 0.017 |
| 3587.125 | 0.016 |
| 3589.054 | 0.016 |
| 3590.982 | 0.017 |
| 3592.911 | 0.017 |
| 3594.84 | 0.017 |
| 3596.768 | 0.017 |
| 3598.697 | 0.017 |
| 3600.625 | 0.016 |
| 3602.554 | 0.016 |
| 3604.482 | 0.016 |
| 3606.411 | 0.015 |
| 3608.34 | 0.015 |
| 3610.268 | 0.015 |
| 3612.197 | 0.015 |
| 3614.125 | 0.015 |
| 3616.054 | 0.015 |
| 3617.982 | 0.014 |
| 3619.911 | 0.014 |
| 3621.84 | 0.014 |
| 3623.768 | 0.015 |
| 3625.697 | 0.014 |
| 3627.625 | 0.013 |
| 3629.554 | 0.014 |
| 3631.482 | 0.014 |
| 3633.411 | 0.015 |
| 3635.339 | 0.015 |
| 3637.268 | 0.015 |
| 3639.197 | 0.015 |
| 3641.125 | 0.015 |
| 3643.054 | 0.015 |
| 3644.982 | 0.015 |
| 3646.911 | 0.014 |
| 3648.839 | 0.014 |
| 3650.768 | 0.014 |
| 3652.697 | 0.015 |
| 3654.625 | 0.015 |
| 3656.554 | 0.016 |
| 3658.482 | 0.017 |
| 3660.411 | 0.017 |
| 3662.339 | 0.018 |
| 3664.268 | 0.018 |
| 3666.197 | 0.017 |
| 3668.125 | 0.016 |
| 3670.053 | 0.016 |
| 3671.982 | 0.016 |
| 3673.911 | 0.015 |
| 3675.839 | 0.015 |
| 3677.768 | 0.015 |
| 3679.696 | 0.016 |
| 3681.625 | 0.016 |
| 3683.553 | 0.016 |
| 3685.482 | 0.016 |
| 3687.411 | 0.015 |
| 3689.339 | 0.015 |
| 3691.268 | 0.015 |
| 3693.196 | 0.015 |
| 3695.125 | 0.015 |
| 3697.053 | 0.015 |
| 3698.982 | 0.015 |
| 3700.911 | 0.014 |
| 3702.839 | 0.014 |
| 3704.768 | 0.014 |
| 3706.696 | 0.014 |
| 3708.625 | 0.014 |
| 3710.553 | 0.014 |
| 3712.482 | 0.014 |
| 3714.41 | 0.015 |
| 3716.339 | 0.015 |
| 3718.268 | 0.015 |
| 3720.196 | 0.015 |
| 3722.125 | 0.015 |
| 3724.053 | 0.015 |
| 3725.982 | 0.015 |
| 3727.91 | 0.016 |
| 3729.839 | 0.016 |
| 3731.768 | 0.016 |
| 3733.696 | 0.016 |
| 3735.625 | 0.016 |
| 3737.553 | 0.017 |
| 3739.482 | 0.018 |
| 3741.41 | 0.018 |
| 3743.339 | 0.017 |
| 3745.268 | 0.017 |
| 3747.196 | 0.018 |
| 3749.125 | 0.018 |
| 3751.053 | 0.018 |
| 3752.982 | 0.019 |
| 3754.91 | 0.019 |
| 3756.839 | 0.019 |
| 3758.767 | 0.018 |
| 3760.696 | 0.018 |
| 3762.625 | 0.018 |
| 3764.553 | 0.018 |
| 3766.482 | 0.018 |
| 3768.41 | 0.018 |
| 3770.339 | 0.018 |
| 3772.267 | 0.018 |
| 3774.196 | 0.018 |
| 3776.125 | 0.018 |
| 3778.053 | 0.017 |
| 3779.982 | 0.017 |
| 3781.91 | 0.017 |
| 3783.839 | 0.017 |
| 3785.767 | 0.017 |
| 3787.696 | 0.017 |
| 3789.624 | 0.017 |
| 3791.553 | 0.017 |
| 3793.481 | 0.017 |
| 3795.41 | 0.017 |
| 3797.339 | 0.017 |
| 3799.267 | 0.016 |
| 3801.196 | 0.016 |
| 3803.124 | 0.017 |
| 3805.053 | 0.017 |
| 3806.981 | 0.017 |
| 3808.91 | 0.018 |
| 3810.839 | 0.018 |
| 3812.767 | 0.018 |
| 3814.696 | 0.018 |
| 3816.624 | 0.018 |
| 3818.553 | 0.019 |
| 3820.481 | 0.019 |
| 3822.41 | 0.02 |
| 3824.339 | 0.02 |
| 3826.267 | 0.02 |
| 3828.196 | 0.021 |
| 3830.124 | 0.02 |
| 3832.053 | 0.02 |
| 3833.981 | 0.02 |
| 3835.91 | 0.019 |
| 3837.838 | 0.019 |
| 3839.767 | 0.02 |
| 3841.696 | 0.02 |
| 3843.624 | 0.021 |
| 3845.553 | 0.021 |
| 3847.481 | 0.021 |
| 3849.41 | 0.021 |
| 3851.338 | 0.02 |
| 3853.267 | 0.019 |
| 3855.196 | 0.02 |
| 3857.124 | 0.021 |
| 3859.053 | 0.021 |
| 3860.981 | 0.021 |
| 3862.91 | 0.021 |
| 3864.838 | 0.022 |
| 3866.767 | 0.022 |
| 3868.695 | 0.022 |
| 3870.624 | 0.023 |
| 3872.552 | 0.023 |
| 3874.481 | 0.024 |
| 3876.41 | 0.024 |
| 3878.338 | 0.024 |
| 3880.267 | 0.024 |
| 3882.195 | 0.025 |
| 3884.124 | 0.025 |
| 3886.052 | 0.026 |
| 3887.981 | 0.027 |
| 3889.91 | 0.027 |
| 3891.838 | 0.028 |
| 3893.767 | 0.028 |
| 3895.695 | 0.028 |
| 3897.624 | 0.027 |
| 3899.552 | 0.026 |
| 3901.481 | 0.026 |
| 3903.41 | 0.025 |
| 3905.338 | 0.025 |
| 3907.267 | 0.025 |
| 3909.195 | 0.025 |
| 3911.124 | 0.025 |
| 3913.052 | 0.024 |
| 3914.981 | 0.024 |
| 3916.909 | 0.024 |
| 3918.838 | 0.024 |
| 3920.767 | 0.024 |
| 3922.695 | 0.024 |
| 3924.624 | 0.024 |
| 3926.552 | 0.024 |
| 3928.481 | 0.024 |
| 3930.409 | 0.024 |
| 3932.338 | 0.024 |
| 3934.267 | 0.024 |
| 3936.195 | 0.024 |
| 3938.124 | 0.024 |
| 3940.052 | 0.024 |
| 3941.981 | 0.024 |
| 3943.909 | 0.024 |
| 3945.838 | 0.024 |
| 3947.766 | 0.024 |
| 3949.695 | 0.024 |
| 3951.624 | 0.025 |
| 3953.552 | 0.025 |
| 3955.481 | 0.025 |
| 3957.409 | 0.024 |
| 3959.338 | 0.024 |
| 3961.266 | 0.024 |
| 3963.195 | 0.024 |
| 3965.124 | 0.024 |
| 3967.052 | 0.023 |
| 3968.981 | 0.023 |
| 3970.909 | 0.023 |
| 3972.838 | 0.022 |
| 3974.766 | 0.022 |
| 3976.695 | 0.022 |
| 3978.624 | 0.022 |
| 3980.552 | 0.022 |
| 3982.48 | 0.022 |
| 3984.409 | 0.022 |
| 3986.338 | 0.021 |
| 3988.266 | 0.021 |
| 3990.195 | 0.021 |
| 3992.123 | 0.021 |
| 3994.052 | 0.022 |
| 3995.98 | 0.022 |
| 3997.909 | 0.022 |
| 3999.838 | 0.022 |
| 4001.766 | 0 |